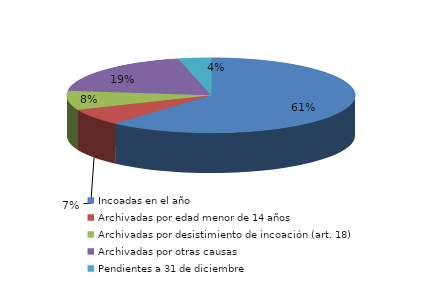
| Category | Series 0 |
|---|---|
| Incoadas en el año | 944 |
| Archivadas por edad menor de 14 años | 110 |
| Archivadas por desistimiento de incoación (art. 18) | 128 |
| Archivadas por otras causas | 297 |
| Pendientes a 31 de diciembre | 56 |